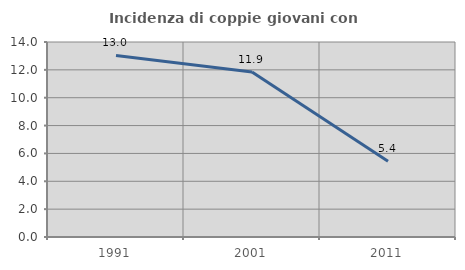
| Category | Incidenza di coppie giovani con figli |
|---|---|
| 1991.0 | 13.031 |
| 2001.0 | 11.852 |
| 2011.0 | 5.44 |